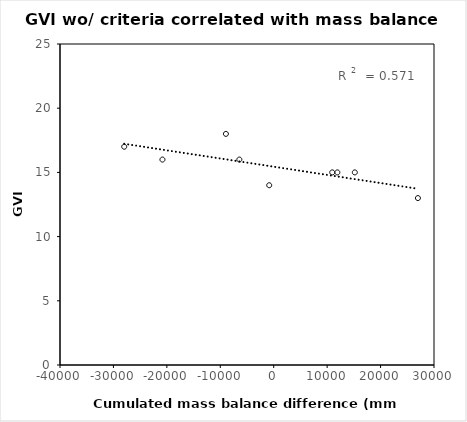
| Category | Series 0 |
|---|---|
| nan | 14 |
| nan | 14 |
| -844.0 | 14 |
| 26988.5 | 13 |
| nan | 21 |
| nan | 13 |
| 10950.5 | 15 |
| 11912.375 | 15 |
| nan | 19 |
| nan | 15 |
| nan | 18 |
| nan | 14 |
| nan | 10 |
| nan | 17 |
| nan | 12 |
| -8947.375 | 18 |
| -27983.5 | 17 |
| nan | 14 |
| nan | 14 |
| -20825.125 | 16 |
| nan | 15 |
| nan | 16 |
| nan | 14 |
| nan | 12 |
| nan | 15 |
| nan | 13 |
| nan | 17 |
| nan | 16 |
| nan | 15 |
| nan | 17 |
| nan | 16 |
| nan | 13 |
| nan | 15 |
| nan | 15 |
| nan | 11 |
| nan | 13 |
| -6430.75 | 16 |
| nan | 16 |
| nan | 17 |
| nan | 16 |
| nan | 15 |
| nan | 15 |
| nan | 15 |
| nan | 14 |
| nan | 16 |
| 15179.375 | 15 |